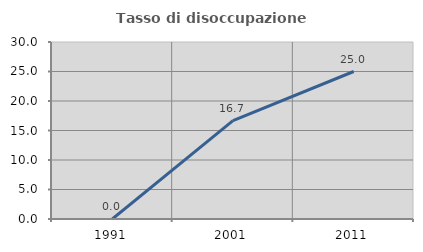
| Category | Tasso di disoccupazione giovanile  |
|---|---|
| 1991.0 | 0 |
| 2001.0 | 16.667 |
| 2011.0 | 25 |